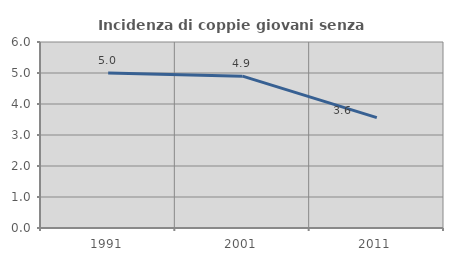
| Category | Incidenza di coppie giovani senza figli |
|---|---|
| 1991.0 | 4.999 |
| 2001.0 | 4.899 |
| 2011.0 | 3.56 |